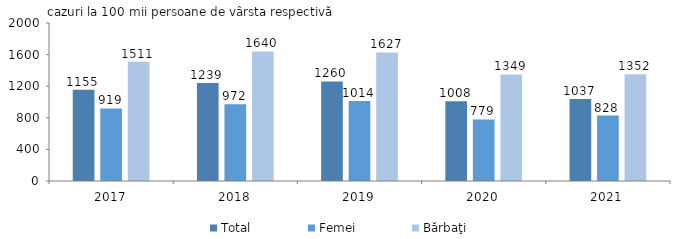
| Category | Total | Femei | Bărbaţi |
|---|---|---|---|
| 2017.0 | 1155 | 919 | 1511 |
| 2018.0 | 1239 | 972 | 1640 |
| 2019.0 | 1260 | 1014 | 1627 |
| 2020.0 | 1008 | 779 | 1349 |
| 2021.0 | 1037 | 828 | 1352 |